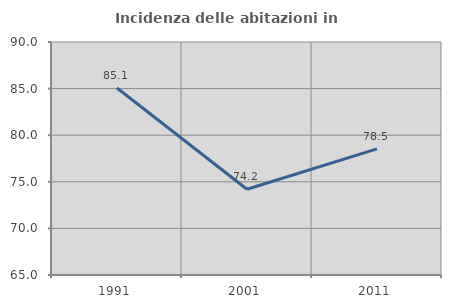
| Category | Incidenza delle abitazioni in proprietà  |
|---|---|
| 1991.0 | 85.068 |
| 2001.0 | 74.202 |
| 2011.0 | 78.538 |